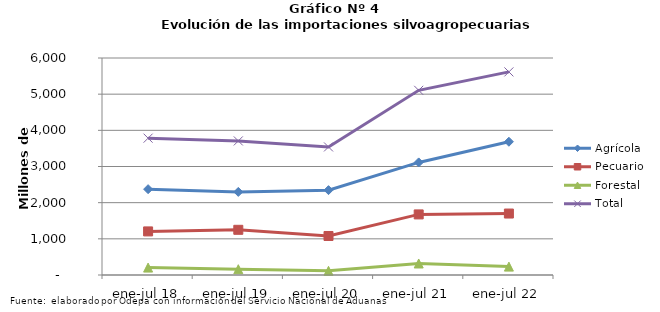
| Category | Agrícola | Pecuario | Forestal | Total |
|---|---|---|---|---|
| ene-jul 18 | 2373202 | 1205273 | 205081 | 3783556 |
| ene-jul 19 | 2297437 | 1249462 | 160128 | 3707027 |
| ene-jul 20 | 2346448 | 1078713 | 115402 | 3540563 |
| ene-jul 21 | 3112943 | 1675246 | 318078 | 5106267 |
| ene-jul 22 | 3684629 | 1699406 | 231758 | 5615793 |